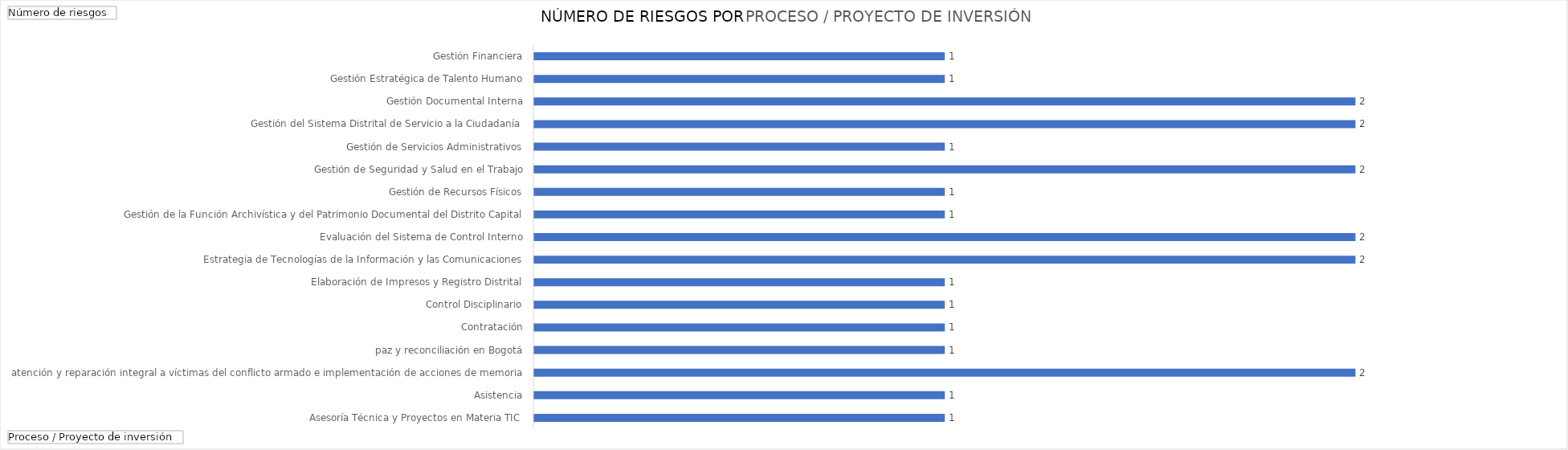
| Category | Total |
|---|---|
| Asesoría Técnica y Proyectos en Materia TIC | 1 |
| Asistencia, atención y reparación integral a víctimas del conflicto armado e implementación de acciones de memoria, paz y reconciliación en Bogotá | 1 |
| Contratación | 2 |
| Control Disciplinario | 1 |
| Elaboración de Impresos y Registro Distrital | 1 |
| Estrategia de Tecnologías de la Información y las Comunicaciones | 1 |
| Evaluación del Sistema de Control Interno | 1 |
| Gestión de la Función Archivística y del Patrimonio Documental del Distrito Capital | 2 |
| Gestión de Recursos Físicos | 2 |
| Gestión de Seguridad y Salud en el Trabajo | 1 |
| Gestión de Servicios Administrativos | 1 |
| Gestión del Sistema Distrital de Servicio a la Ciudadanía | 2 |
| Gestión Documental Interna | 1 |
| Gestión Estratégica de Talento Humano | 2 |
| Gestión Financiera | 2 |
| Gestión Jurídica | 1 |
| Gestión, Administración y Soporte de infraestructura y Recursos tecnológicos | 1 |